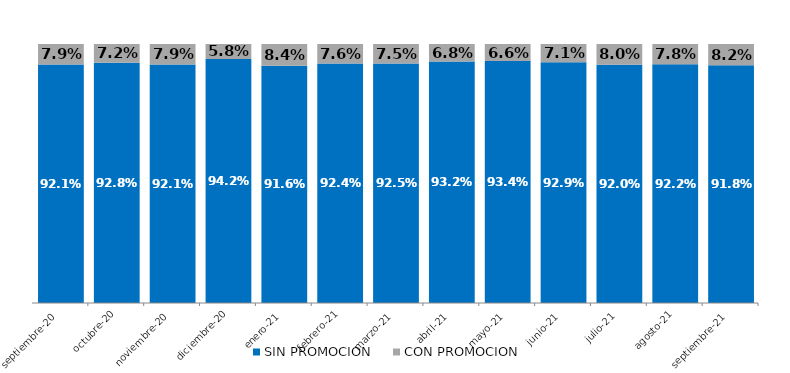
| Category | SIN PROMOCION   | CON PROMOCION   |
|---|---|---|
| 2020-09-01 | 0.921 | 0.079 |
| 2020-10-01 | 0.928 | 0.072 |
| 2020-11-01 | 0.921 | 0.079 |
| 2020-12-01 | 0.942 | 0.058 |
| 2021-01-01 | 0.916 | 0.084 |
| 2021-02-01 | 0.924 | 0.076 |
| 2021-03-01 | 0.925 | 0.075 |
| 2021-04-01 | 0.932 | 0.068 |
| 2021-05-01 | 0.934 | 0.066 |
| 2021-06-01 | 0.929 | 0.071 |
| 2021-07-01 | 0.92 | 0.08 |
| 2021-08-01 | 0.922 | 0.078 |
| 2021-09-01 | 0.918 | 0.082 |